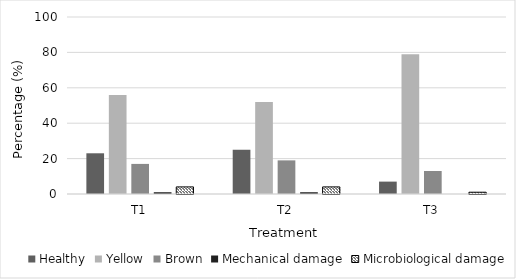
| Category | Healthy | Yellow | Brown | Mechanical damage | Microbiological damage |
|---|---|---|---|---|---|
| T1 | 23 | 56 | 17 | 1 | 4 |
| T2 | 25 | 52 | 19 | 1 | 4 |
| T3 | 7 | 79 | 13 | 0 | 1 |